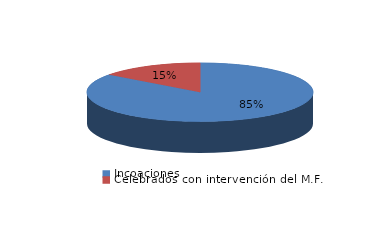
| Category | Series 0 |
|---|---|
| Incoaciones | 12199 |
| Celebrados con intervención del M.F. | 2125 |